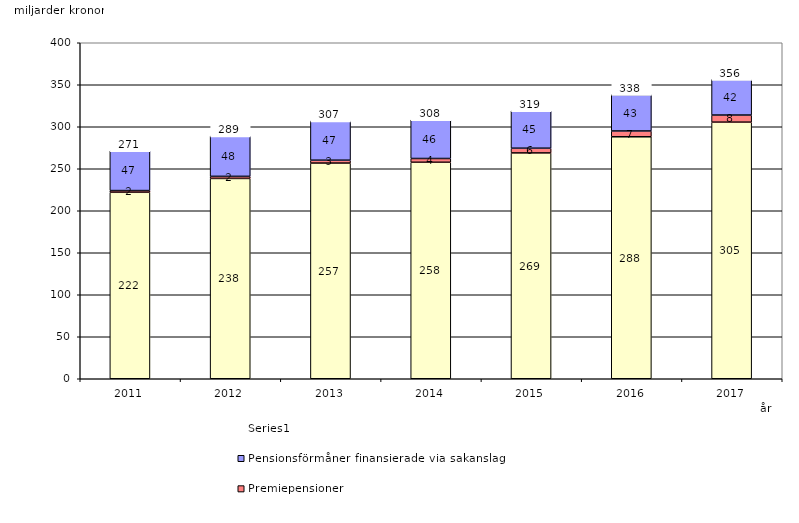
| Category | Inkomstpension och tilläggspension m.m. | Premiepensioner | Pensionsförmåner finansierade via sakanslag | Series 0 |
|---|---|---|---|---|
| 2011.0 | 222.004 | 2.022 | 47.319 | 20 |
| 2012.0 | 238.478 | 2.465 | 48.024 | 20 |
| 2013.0 | 256.777 | 3.402 | 46.801 | 20 |
| 2014.0 | 257.73 | 4.48 | 46.082 | 20 |
| 2015.0 | 268.86 | 5.604 | 44.58 | 20 |
| 2016.0 | 288.074 | 6.917 | 43.266 | 20 |
| 2017.0 | 305.48 | 8.47 | 42.412 | 20 |